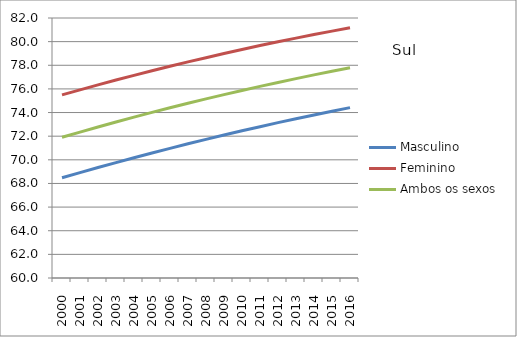
| Category | Masculino | Feminino | Ambos os sexos |
|---|---|---|---|
| 2000.0 | 68.485 | 75.493 | 71.908 |
| 2001.0 | 68.919 | 75.922 | 72.347 |
| 2002.0 | 69.346 | 76.343 | 72.779 |
| 2003.0 | 69.765 | 76.749 | 73.198 |
| 2004.0 | 70.176 | 77.145 | 73.609 |
| 2005.0 | 70.579 | 77.535 | 74.011 |
| 2006.0 | 70.971 | 77.917 | 74.404 |
| 2007.0 | 71.354 | 78.287 | 74.786 |
| 2008.0 | 71.729 | 78.641 | 75.154 |
| 2009.0 | 72.096 | 78.993 | 75.518 |
| 2010.0 | 72.457 | 79.333 | 75.872 |
| 2011.0 | 72.803 | 79.668 | 76.216 |
| 2012.0 | 73.145 | 79.986 | 76.548 |
| 2013.0 | 73.476 | 80.296 | 76.871 |
| 2014.0 | 73.799 | 80.598 | 77.187 |
| 2015.0 | 74.113 | 80.891 | 77.492 |
| 2016.0 | 74.418 | 81.175 | 77.789 |